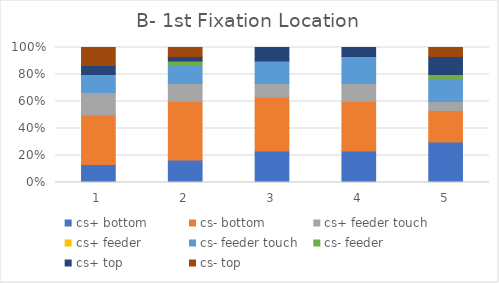
| Category | cs+ bottom | cs- bottom | cs+ feeder touch | cs+ feeder | cs- feeder touch | cs- feeder | cs+ top | cs- top |
|---|---|---|---|---|---|---|---|---|
| 0 | 4 | 11 | 5 | 0 | 4 | 0 | 2 | 4 |
| 1 | 5 | 13 | 4 | 0 | 4 | 1 | 1 | 2 |
| 2 | 7 | 12 | 3 | 0 | 5 | 0 | 3 | 0 |
| 3 | 7 | 11 | 4 | 0 | 6 | 0 | 2 | 0 |
| 4 | 9 | 7 | 2 | 0 | 5 | 1 | 4 | 2 |